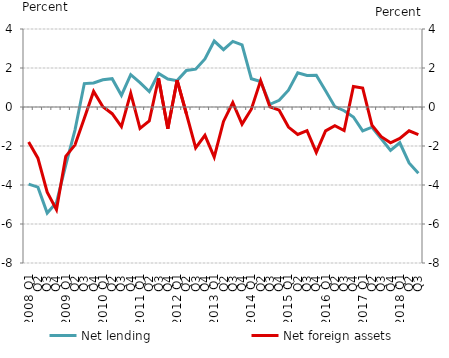
| Category | Net lending |
|---|---|
| 2008 Q1 | -3.953 |
| Q2 | -4.111 |
| Q3 | -5.439 |
| Q4 | -4.897 |
| 2009 Q1 | -2.976 |
| Q2 | -1.172 |
| Q3 | 1.202 |
| Q4 | 1.236 |
| 2010 Q1 | 1.395 |
| Q2 | 1.45 |
| Q3 | 0.599 |
| Q4 | 1.66 |
| 2011 Q1 | 1.246 |
| Q2 | 0.788 |
| Q3 | 1.72 |
| Q4 | 1.434 |
| 2012 Q1 | 1.352 |
| Q2 | 1.873 |
| Q3 | 1.941 |
| Q4 | 2.467 |
| 2013 Q1 | 3.383 |
| Q2 | 2.94 |
| Q3 | 3.364 |
| Q4 | 3.185 |
| 2014 Q1 | 1.451 |
| Q2 | 1.308 |
| Q3 | 0.138 |
| Q4 | 0.343 |
| 2015 Q1 | 0.863 |
| Q2 | 1.758 |
| Q3 | 1.614 |
| Q4 | 1.626 |
| 2016 Q1 | 0.833 |
| Q2 | 0.017 |
| Q3 | -0.191 |
| Q4 | -0.513 |
| 2017 Q1 | -1.223 |
| Q2 | -1.037 |
| Q3 | -1.629 |
| Q4 | -2.228 |
| 2018 Q1 | -1.834 |
| Q2 | -2.871 |
| Q3 | -3.393 |